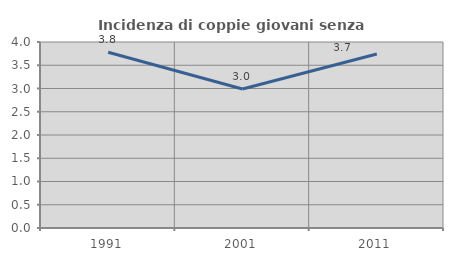
| Category | Incidenza di coppie giovani senza figli |
|---|---|
| 1991.0 | 3.78 |
| 2001.0 | 2.99 |
| 2011.0 | 3.741 |